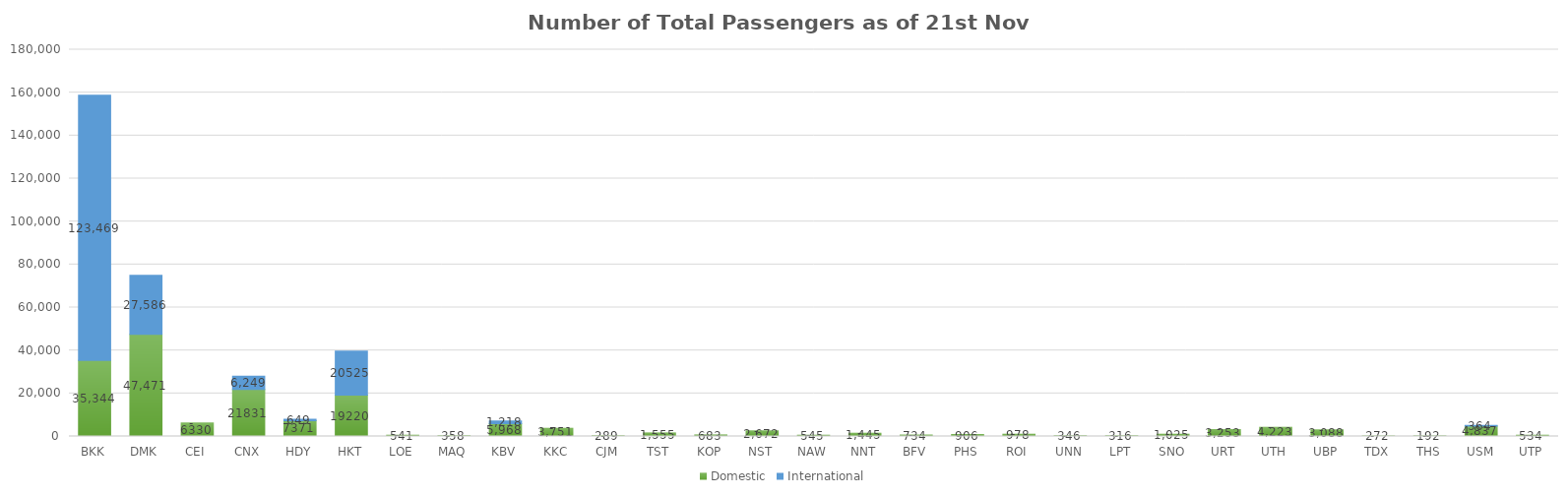
| Category | Domestic | International |
|---|---|---|
| BKK | 35344 | 123469 |
| DMK | 47471 | 27586 |
| CEI | 6330 | 0 |
| CNX | 21831 | 6249 |
| HDY | 7371 | 649 |
| HKT | 19220 | 20525 |
| LOE | 541 | 0 |
| MAQ | 358 | 0 |
| KBV | 5968 | 1218 |
| KKC | 3751 | 0 |
| CJM | 289 | 0 |
| TST | 1555 | 0 |
| KOP | 683 | 0 |
| NST | 2672 | 0 |
| NAW | 545 | 0 |
| NNT | 1445 | 0 |
| BFV | 734 | 0 |
| PHS | 906 | 0 |
| ROI | 978 | 0 |
| UNN | 346 | 0 |
| LPT | 316 | 0 |
| SNO | 1025 | 0 |
| URT | 3253 | 0 |
| UTH | 4223 | 0 |
| UBP | 3088 | 0 |
| TDX | 272 | 0 |
| THS | 192 | 0 |
| USM | 4837 | 364 |
| UTP | 534 | 0 |